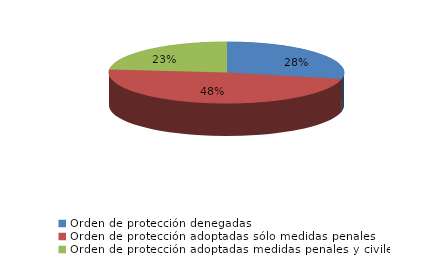
| Category | Series 0 |
|---|---|
| Orden de protección denegadas | 23 |
| Orden de protección adoptadas sólo medidas penales | 39 |
| Orden de protección adoptadas medidas penales y civiles | 19 |